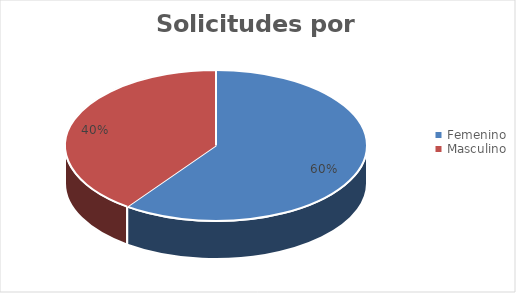
| Category | Cantidad |
|---|---|
| Femenino | 3 |
| Masculino | 2 |